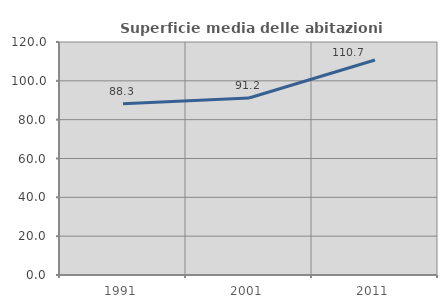
| Category | Superficie media delle abitazioni occupate |
|---|---|
| 1991.0 | 88.26 |
| 2001.0 | 91.186 |
| 2011.0 | 110.722 |